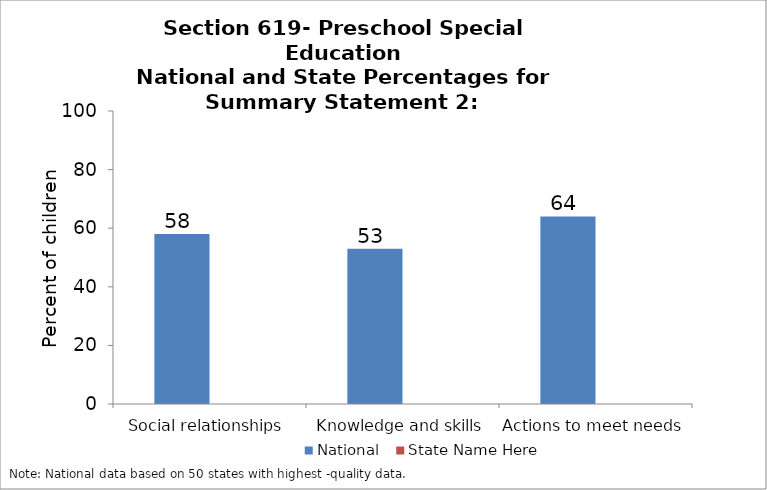
| Category | National | State Name Here |
|---|---|---|
| Social relationships | 58 |  |
| Knowledge and skills | 53 |  |
| Actions to meet needs | 64 |  |